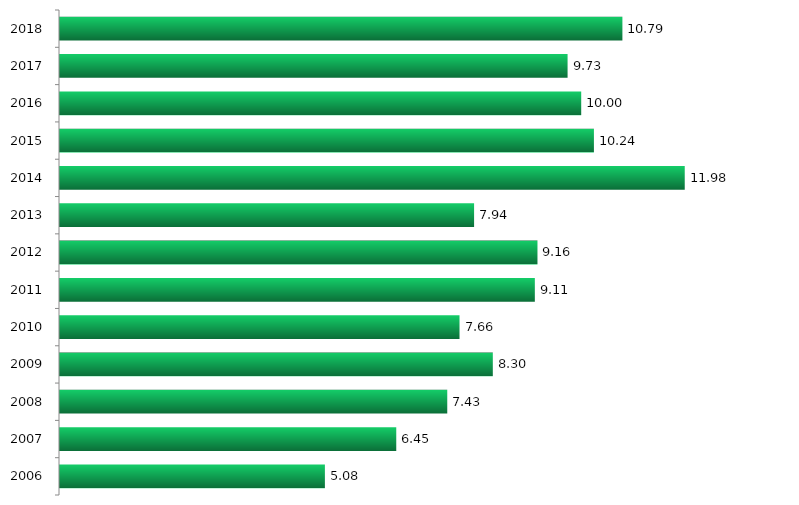
| Category | Concorrência |
|---|---|
| 2006.0 | 5.08 |
| 2007.0 | 6.449 |
| 2008.0 | 7.427 |
| 2009.0 | 8.301 |
| 2010.0 | 7.662 |
| 2011.0 | 9.106 |
| 2012.0 | 9.157 |
| 2013.0 | 7.941 |
| 2014.0 | 11.981 |
| 2015.0 | 10.24 |
| 2016.0 | 9.996 |
| 2017.0 | 9.734 |
| 2018.0 | 10.786 |